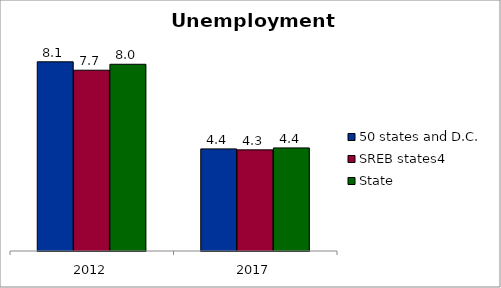
| Category | 50 states and D.C. | SREB states4 | State |
|---|---|---|---|
| 2012.0 | 8.07 | 7.711 | 7.965 |
| 2017.0 | 4.355 | 4.314 | 4.397 |